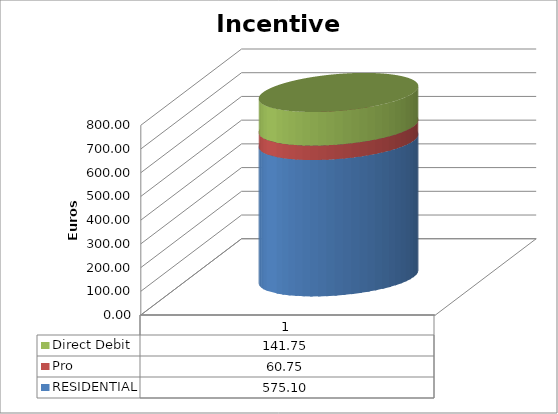
| Category | RESIDENTIAL | Pro | Direct Debit |
|---|---|---|---|
| 0 | 575.1 | 60.75 | 141.75 |